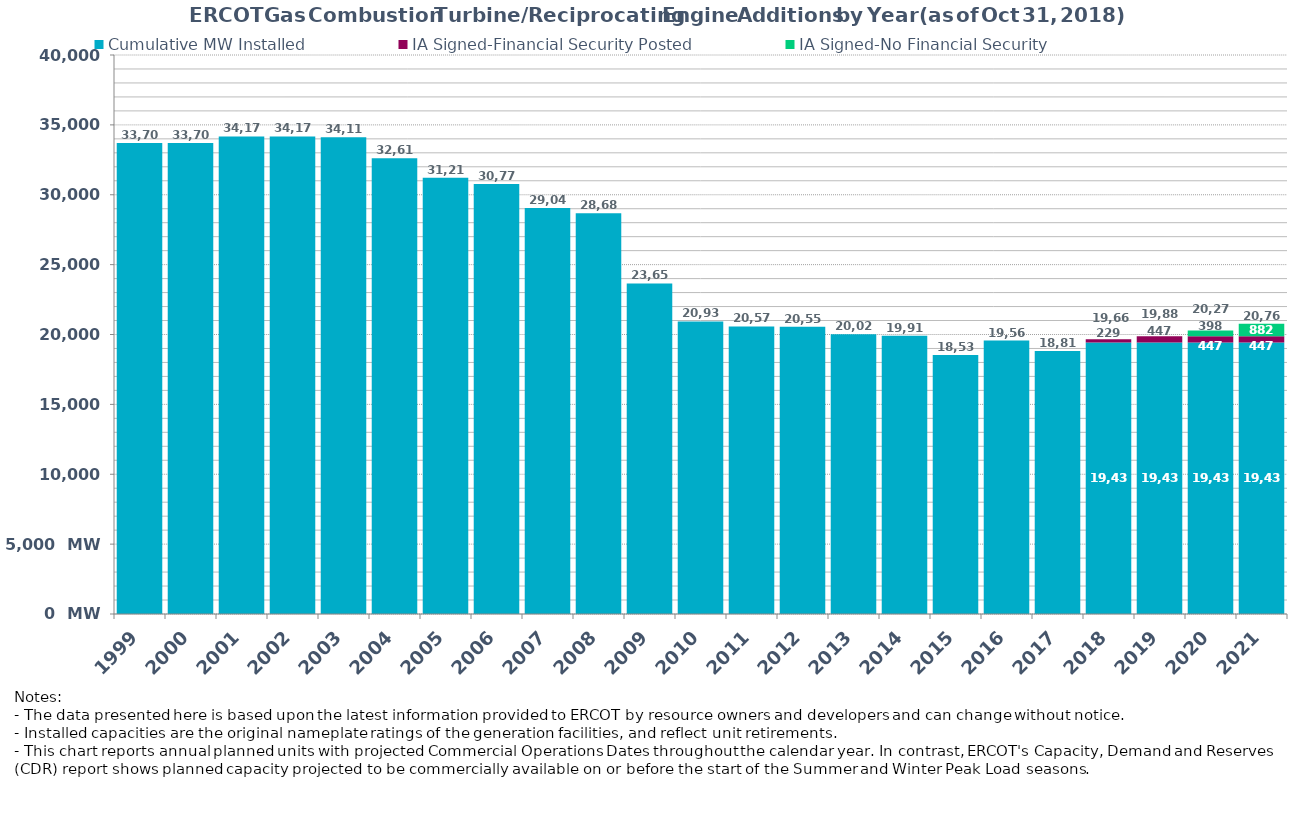
| Category | Cumulative MW Installed | IA Signed-Financial Security Posted  | IA Signed-No Financial Security  | Cumulative Installed and Planned |
|---|---|---|---|---|
| 1999.0 | 33703 | 0 | 0 | 33703 |
| 2000.0 | 33703 | 0 | 0 | 33703 |
| 2001.0 | 34170 | 0 | 0 | 34170 |
| 2002.0 | 34170 | 0 | 0 | 34170 |
| 2003.0 | 34118 | 0 | 0 | 34118 |
| 2004.0 | 32616 | 0 | 0 | 32616 |
| 2005.0 | 31217 | 0 | 0 | 31217 |
| 2006.0 | 30774 | 0 | 0 | 30774 |
| 2007.0 | 29048 | 0 | 0 | 29048 |
| 2008.0 | 28681 | 0 | 0 | 28681 |
| 2009.0 | 23651 | 0 | 0 | 23651 |
| 2010.0 | 20937 | 0 | 0 | 20937 |
| 2011.0 | 20575 | 0 | 0 | 20575 |
| 2012.0 | 20551 | 0 | 0 | 20551 |
| 2013.0 | 20026 | 0 | 0 | 20026 |
| 2014.0 | 19917 | 0 | 0 | 19917 |
| 2015.0 | 18538 | 0 | 0 | 18538 |
| 2016.0 | 19564 | 0 | 0 | 19564 |
| 2017.0 | 18818 | 0 | 0 | 18818 |
| 2018.0 | 19433 | 229 | 0 | 19662 |
| 2019.0 | 19433 | 447 | 0 | 19880 |
| 2020.0 | 19433 | 447 | 397.8 | 20277.8 |
| 2021.0 | 19433 | 447 | 881.8 | 20761.8 |